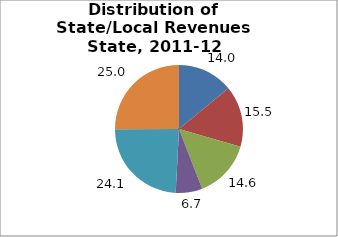
| Category | Series 0 |
|---|---|
| General Sales | 14.011 |
| Property | 15.455 |
| Income1 | 14.643 |
| Other | 6.716 |
| From Federal Government | 24.139 |
| Nontax Revenues2 | 25.036 |